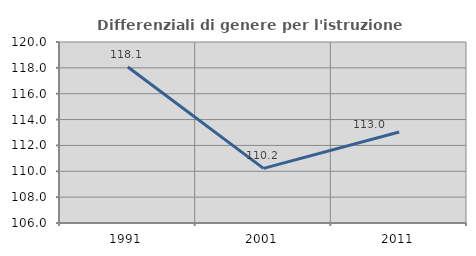
| Category | Differenziali di genere per l'istruzione superiore |
|---|---|
| 1991.0 | 118.07 |
| 2001.0 | 110.221 |
| 2011.0 | 113.041 |